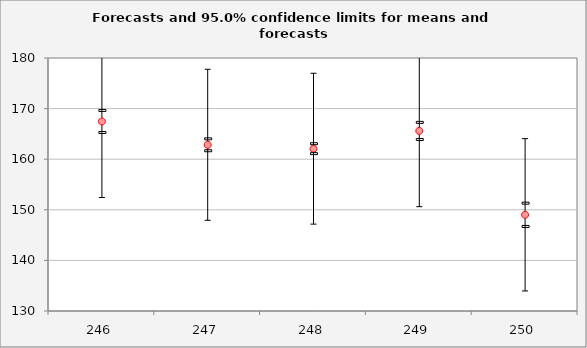
| Category | Forecast | Upper95%M | Lower95%M |
|---|---|---|---|
| 246.0 | 167.458 | 169.638 | 165.279 |
| 247.0 | 162.844 | 164.02 | 161.668 |
| 248.0 | 162.078 | 163.06 | 161.096 |
| 249.0 | 165.587 | 167.275 | 163.898 |
| 250.0 | 149.014 | 151.315 | 146.713 |